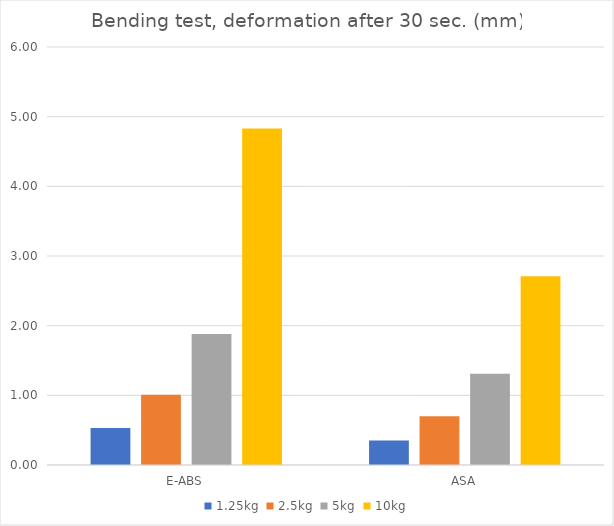
| Category | 1.25kg | 2.5kg | 5kg | 10kg |
|---|---|---|---|---|
| E-ABS | 0.53 | 1.01 | 1.88 | 4.83 |
| ASA | 0.35 | 0.7 | 1.31 | 2.71 |